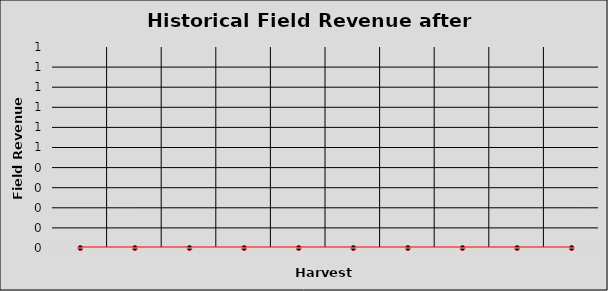
| Category | Yield |
|---|---|
|  | 0 |
|  | 0 |
|  | 0 |
|  | 0 |
|  | 0 |
|  | 0 |
|  | 0 |
|  | 0 |
|  | 0 |
|  | 0 |